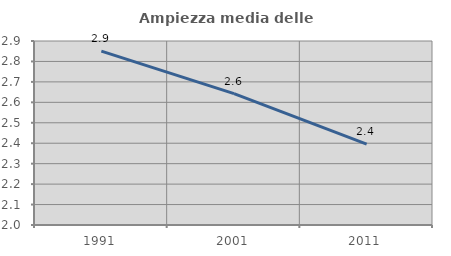
| Category | Ampiezza media delle famiglie |
|---|---|
| 1991.0 | 2.85 |
| 2001.0 | 2.643 |
| 2011.0 | 2.396 |